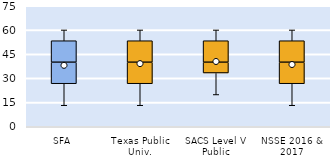
| Category | 25th | 50th | 75th |
|---|---|---|---|
| SFA | 26.667 | 13.333 | 13.333 |
| Texas Public Univ. | 26.667 | 13.333 | 13.333 |
| SACS Level V Public | 33.333 | 6.667 | 13.333 |
| NSSE 2016 & 2017 | 26.667 | 13.333 | 13.333 |